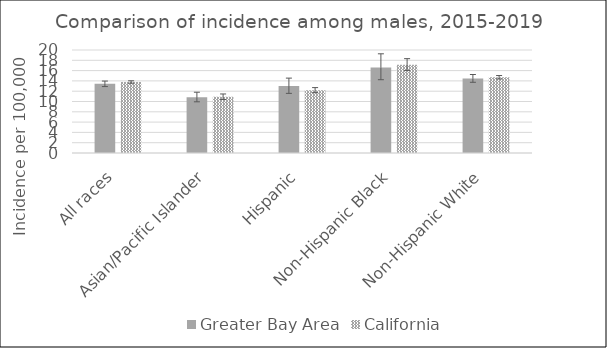
| Category | Greater Bay Area | California | SEER 18 |
|---|---|---|---|
| All races | 13.43 | 13.78 |  |
| Asian/Pacific Islander | 10.84 | 10.92 |  |
| Hispanic | 13 | 12.2 |  |
| Non-Hispanic Black | 16.6 | 17.15 |  |
| Non-Hispanic White | 14.47 | 14.7 |  |